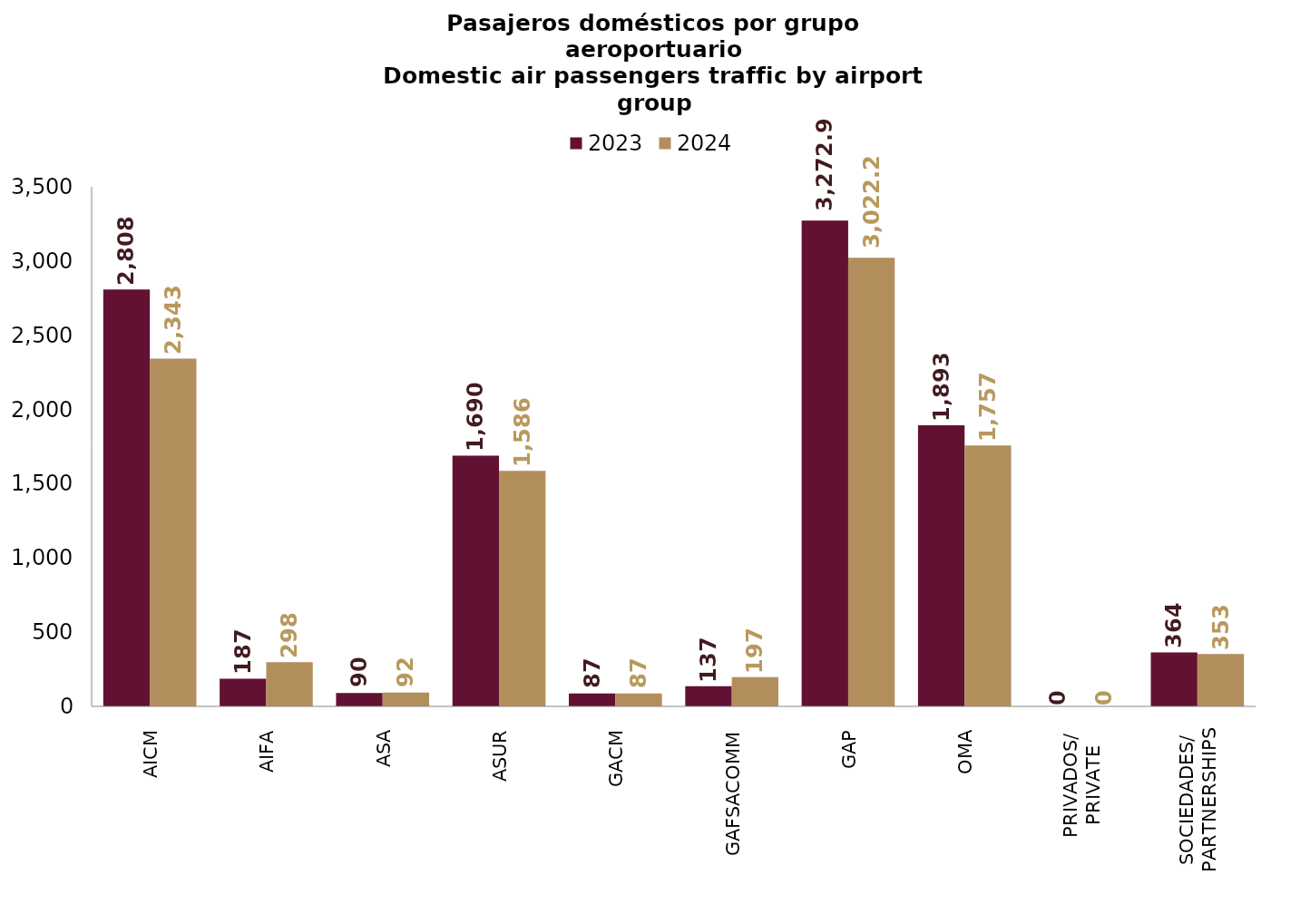
| Category | 2023 | 2024 |
|---|---|---|
| AICM | 2807.727 | 2343.242 |
| AIFA | 186.628 | 298.403 |
| ASA | 89.931 | 92.424 |
| ASUR | 1689.638 | 1586.213 |
| GACM | 86.895 | 87.319 |
| GAFSACOMM | 136.654 | 196.641 |
| GAP | 3272.897 | 3022.28 |
| OMA | 1893.425 | 1757.015 |
| PRIVADOS/
PRIVATE | 0.194 | 0.307 |
| SOCIEDADES/
PARTNERSHIPS | 364.183 | 353.379 |